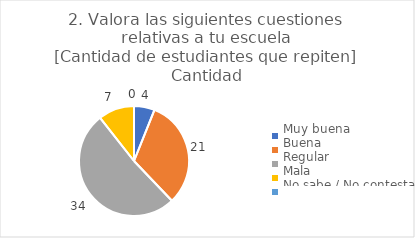
| Category | 2. Valora las siguientes cuestiones relativas a tu escuela
[Cantidad de estudiantes que repiten] |
|---|---|
| Muy buena  | 0.061 |
| Buena  | 0.318 |
| Regular  | 0.515 |
| Mala  | 0.106 |
| No sabe / No contesta | 0 |